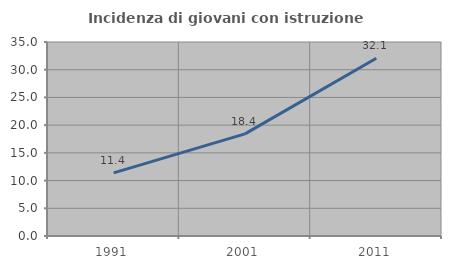
| Category | Incidenza di giovani con istruzione universitaria |
|---|---|
| 1991.0 | 11.387 |
| 2001.0 | 18.428 |
| 2011.0 | 32.078 |